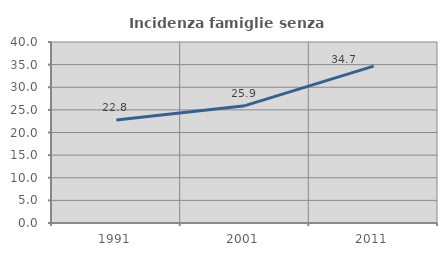
| Category | Incidenza famiglie senza nuclei |
|---|---|
| 1991.0 | 22.779 |
| 2001.0 | 25.93 |
| 2011.0 | 34.661 |